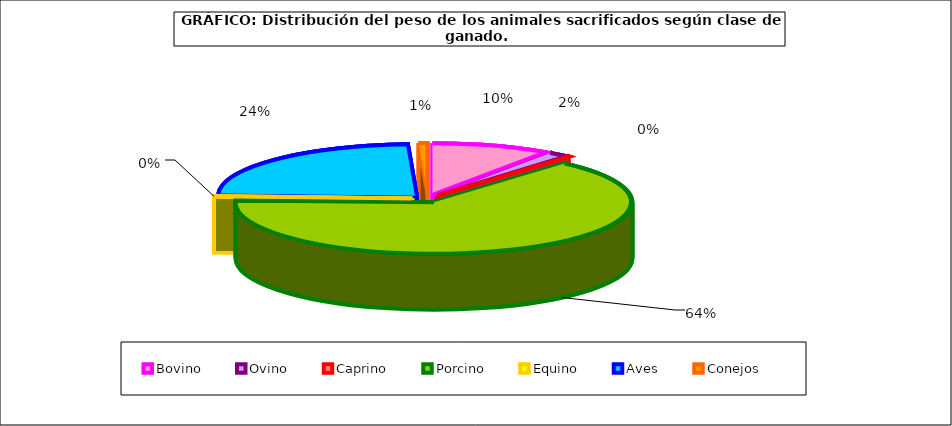
| Category | Series 0 |
|---|---|
| 0 | 695163.266 |
| 1 | 121338.476 |
| 2 | 10419.912 |
| 3 | 4641164.334 |
| 4 | 9631.755 |
| 5 | 1705190.214 |
| 6 | 52143.325 |